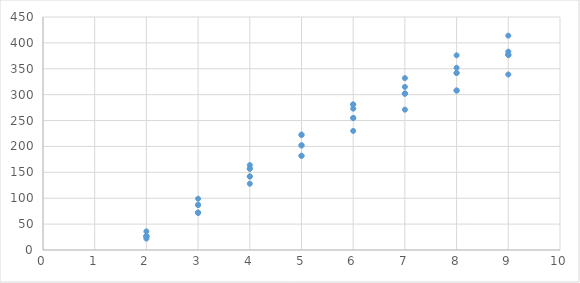
| Category | Series 0 |
|---|---|
| 2.0 | 36 |
| 2.0 | 27 |
| 2.0 | 27 |
| 2.0 | 22 |
| 2.0 | 27 |
| 2.0 | 25 |
| 3.0 | 99 |
| 3.0 | 72 |
| 3.0 | 72 |
| 3.0 | 87 |
| 3.0 | 72 |
| 3.0 | 87 |
| 4.0 | 164 |
| 4.0 | 142 |
| 4.0 | 157 |
| 4.0 | 157 |
| 4.0 | 128 |
| 4.0 | 142 |
| 5.0 | 223 |
| 5.0 | 202 |
| 5.0 | 182 |
| 5.0 | 222 |
| 5.0 | 182 |
| 5.0 | 202 |
| 6.0 | 273 |
| 6.0 | 255 |
| 6.0 | 230 |
| 6.0 | 255 |
| 6.0 | 281 |
| 6.0 | 281 |
| 7.0 | 315 |
| 7.0 | 302 |
| 7.0 | 302 |
| 7.0 | 302 |
| 7.0 | 271 |
| 7.0 | 332 |
| 8.0 | 352 |
| 8.0 | 342 |
| 8.0 | 376 |
| 8.0 | 342 |
| 8.0 | 308 |
| 8.0 | 308 |
| 9.0 | 383 |
| 9.0 | 414 |
| 9.0 | 339 |
| 9.0 | 377 |
| 9.0 | 377 |
| 9.0 | 377 |